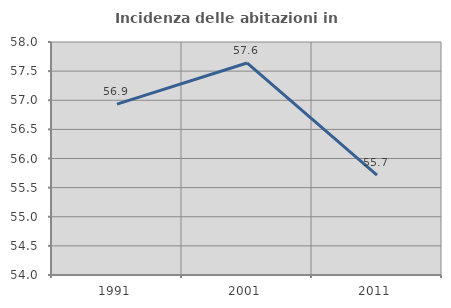
| Category | Incidenza delle abitazioni in proprietà  |
|---|---|
| 1991.0 | 56.934 |
| 2001.0 | 57.64 |
| 2011.0 | 55.716 |